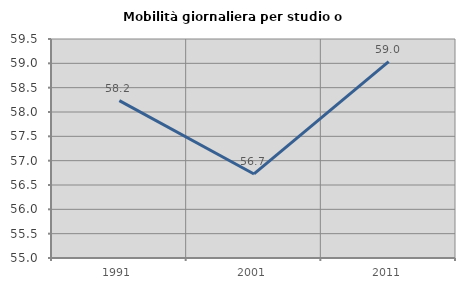
| Category | Mobilità giornaliera per studio o lavoro |
|---|---|
| 1991.0 | 58.235 |
| 2001.0 | 56.727 |
| 2011.0 | 59.036 |